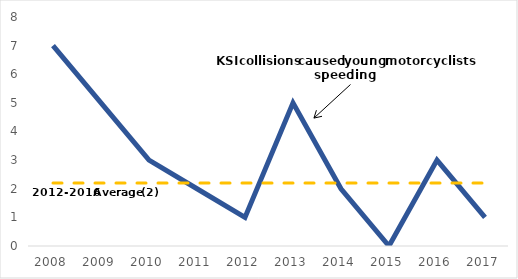
| Category | Series 0 | Series 1 |
|---|---|---|
| 2008.0 | 7 | 2.2 |
| 2009.0 | 5 | 2.2 |
| 2010.0 | 3 | 2.2 |
| 2011.0 | 2 | 2.2 |
| 2012.0 | 1 | 2.2 |
| 2013.0 | 5 | 2.2 |
| 2014.0 | 2 | 2.2 |
| 2015.0 | 0 | 2.2 |
| 2016.0 | 3 | 2.2 |
| 2017.0 | 1 | 2.2 |